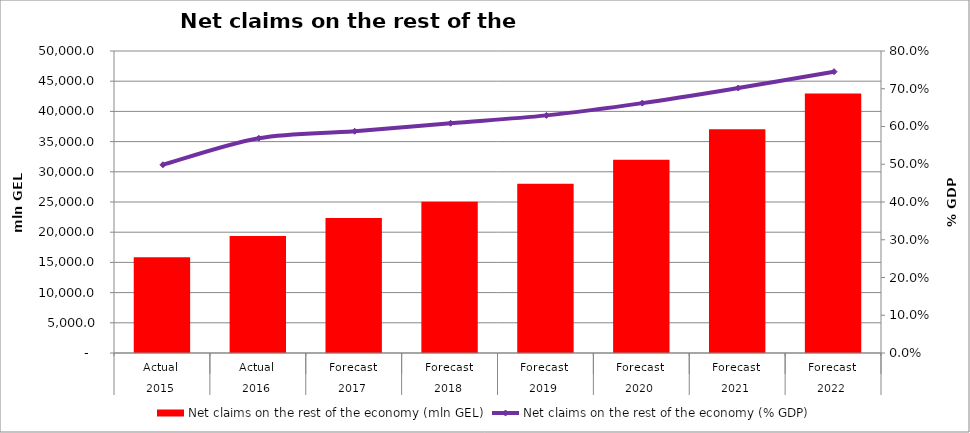
| Category | Net claims on the rest of the economy (mln GEL) |
|---|---|
| 0 | 15832.596 |
| 1 | 19360.489 |
| 2 | 22352.321 |
| 3 | 25043.45 |
| 4 | 28009.79 |
| 5 | 32007.46 |
| 6 | 37057.3 |
| 7 | 42954.89 |